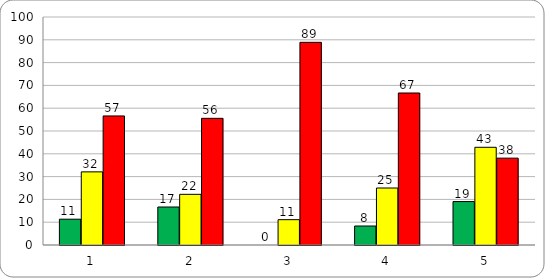
| Category | Series 0 | Series 1 | Series 2 |
|---|---|---|---|
| 0 | 11.321 | 32.075 | 56.604 |
| 1 | 16.667 | 22.222 | 55.556 |
| 2 | 0 | 11.111 | 88.889 |
| 3 | 8.333 | 25 | 66.667 |
| 4 | 19.048 | 42.857 | 38.095 |